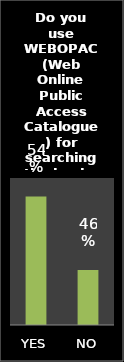
| Category | Series 0 |
|---|---|
| YES | 0.54 |
| NO | 0.46 |